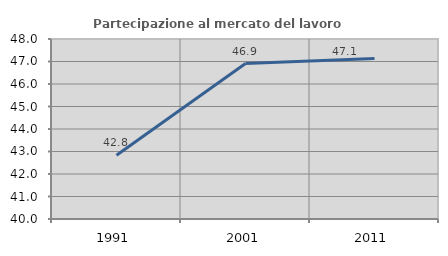
| Category | Partecipazione al mercato del lavoro  femminile |
|---|---|
| 1991.0 | 42.832 |
| 2001.0 | 46.907 |
| 2011.0 | 47.134 |